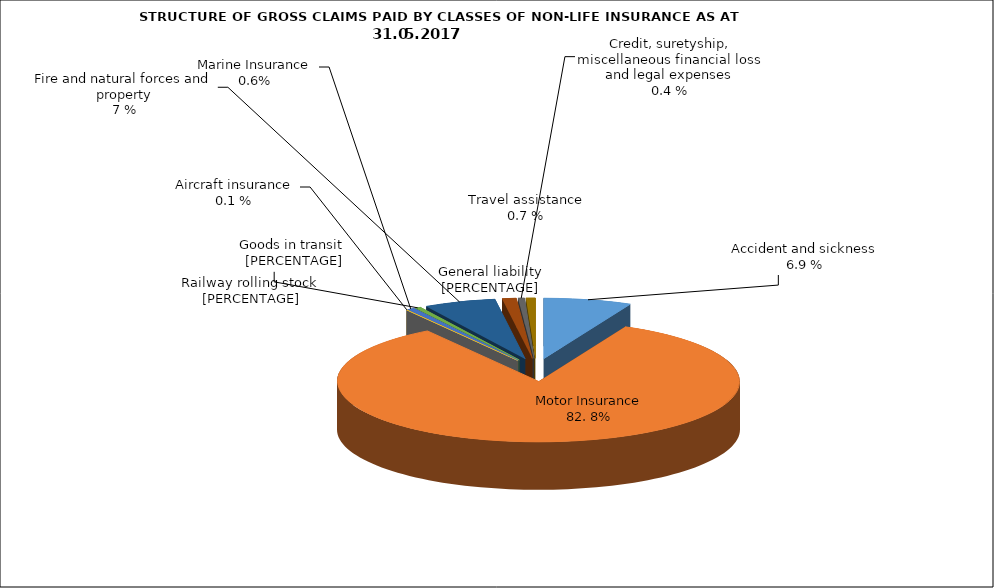
| Category | Злополука и заболяване МПС Релсови превозни средства Летателни апарати Плаванелни съдове Товари по време на превоз Пожар и природни бедствия и други щети на имущество Обща гражданска отговорност Кредити, гаранции, разни финансови загуби и правни разноски |
|---|---|
| Злополука и заболяване | 0.071 |
| МПС | 0.836 |
| Релсови превозни средства | 0 |
| Летателни апарати | 0 |
| Плаванелни съдове | 0.006 |
| Товари по време на превоз | 0.005 |
| Пожар и природни бедствия и други щети на имущество | 0.058 |
| Обща гражданска отговорност | 0.011 |
| Кредити, гаранции, разни финансови загуби и правни разноски | 0.005 |
| Помощ при пътуване | 0.008 |